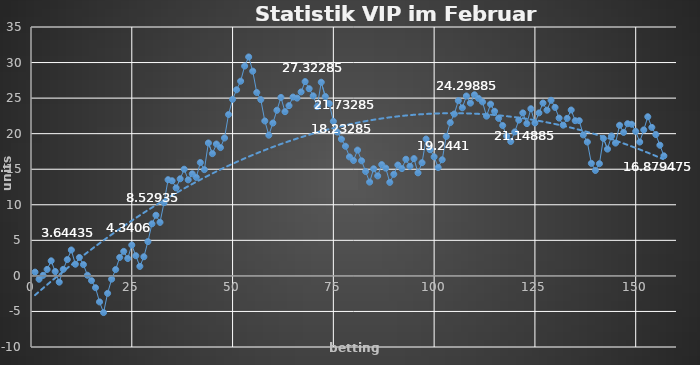
| Category | Series 0 |
|---|---|
| 0 | 0.531 |
| 1 | -0.469 |
| 2 | 0.078 |
| 3 | 0.909 |
| 4 | 2.119 |
| 5 | 0.619 |
| 6 | -0.881 |
| 7 | 0.919 |
| 8 | 2.294 |
| 9 | 3.644 |
| 10 | 1.644 |
| 11 | 2.592 |
| 12 | 1.592 |
| 13 | 0.092 |
| 14 | -0.658 |
| 15 | -1.658 |
| 16 | -3.658 |
| 17 | -5.158 |
| 18 | -2.458 |
| 19 | -0.458 |
| 20 | 0.892 |
| 21 | 2.597 |
| 22 | 3.447 |
| 23 | 2.447 |
| 24 | 4.341 |
| 25 | 2.841 |
| 26 | 1.341 |
| 27 | 2.691 |
| 28 | 4.822 |
| 29 | 7.322 |
| 30 | 8.529 |
| 31 | 7.529 |
| 32 | 10.301 |
| 33 | 13.526 |
| 34 | 13.376 |
| 35 | 12.376 |
| 36 | 13.654 |
| 37 | 15.004 |
| 38 | 13.504 |
| 39 | 14.354 |
| 40 | 13.854 |
| 41 | 15.942 |
| 42 | 14.942 |
| 43 | 18.692 |
| 44 | 17.192 |
| 45 | 18.542 |
| 46 | 18.042 |
| 47 | 19.392 |
| 48 | 22.692 |
| 49 | 24.823 |
| 50 | 26.173 |
| 51 | 27.381 |
| 52 | 29.511 |
| 53 | 30.789 |
| 54 | 28.789 |
| 55 | 25.789 |
| 56 | 24.789 |
| 57 | 21.789 |
| 58 | 19.789 |
| 59 | 21.494 |
| 60 | 23.294 |
| 61 | 25.094 |
| 62 | 23.094 |
| 63 | 23.941 |
| 64 | 25.149 |
| 65 | 24.999 |
| 66 | 25.868 |
| 67 | 27.323 |
| 68 | 26.323 |
| 69 | 25.323 |
| 70 | 23.823 |
| 71 | 27.233 |
| 72 | 25.233 |
| 73 | 24.233 |
| 74 | 21.733 |
| 75 | 20.233 |
| 76 | 19.233 |
| 77 | 18.233 |
| 78 | 16.733 |
| 79 | 16.233 |
| 80 | 17.688 |
| 81 | 16.188 |
| 82 | 14.688 |
| 83 | 13.188 |
| 84 | 15.064 |
| 85 | 14.064 |
| 86 | 15.654 |
| 87 | 15.154 |
| 88 | 13.154 |
| 89 | 14.29 |
| 90 | 15.594 |
| 91 | 15.094 |
| 92 | 16.402 |
| 93 | 15.402 |
| 94 | 16.492 |
| 95 | 14.492 |
| 96 | 15.917 |
| 97 | 19.244 |
| 98 | 17.744 |
| 99 | 16.744 |
| 100 | 15.244 |
| 101 | 16.334 |
| 102 | 19.609 |
| 103 | 21.554 |
| 104 | 22.762 |
| 105 | 24.639 |
| 106 | 23.639 |
| 107 | 25.299 |
| 108 | 24.299 |
| 109 | 25.469 |
| 110 | 24.969 |
| 111 | 24.469 |
| 112 | 22.469 |
| 113 | 24.149 |
| 114 | 23.149 |
| 115 | 22.149 |
| 116 | 21.149 |
| 117 | 19.649 |
| 118 | 18.899 |
| 119 | 20.245 |
| 120 | 21.903 |
| 121 | 22.918 |
| 122 | 21.418 |
| 123 | 23.505 |
| 124 | 21.505 |
| 125 | 22.92 |
| 126 | 24.305 |
| 127 | 23.305 |
| 128 | 24.695 |
| 129 | 23.695 |
| 130 | 22.195 |
| 131 | 21.195 |
| 132 | 22.147 |
| 133 | 23.327 |
| 134 | 21.827 |
| 135 | 21.827 |
| 136 | 19.827 |
| 137 | 18.827 |
| 138 | 15.827 |
| 139 | 14.827 |
| 140 | 15.775 |
| 141 | 19.33 |
| 142 | 17.83 |
| 143 | 19.68 |
| 144 | 18.68 |
| 145 | 21.18 |
| 146 | 20.18 |
| 147 | 21.399 |
| 148 | 21.324 |
| 149 | 20.324 |
| 150 | 18.824 |
| 151 | 20.529 |
| 152 | 22.379 |
| 153 | 20.879 |
| 154 | 19.879 |
| 155 | 18.379 |
| 156 | 16.879 |